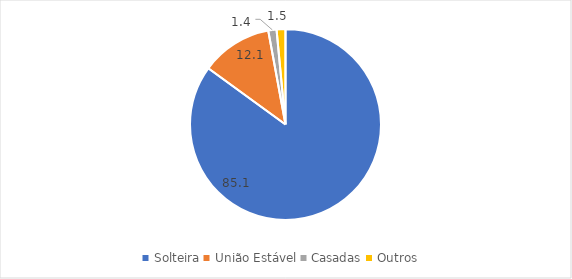
| Category | Series 0 |
|---|---|
| Solteira | 85.1 |
| União Estável | 12.1 |
| Casadas | 1.4 |
| Outros | 1.5 |